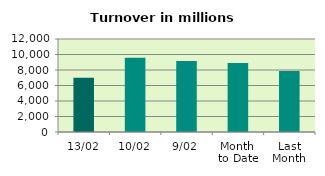
| Category | Series 0 |
|---|---|
| 13/02 | 7004.114 |
| 10/02 | 9578.714 |
| 9/02 | 9148.94 |
| Month 
to Date | 8887.357 |
| Last
Month | 7855.802 |